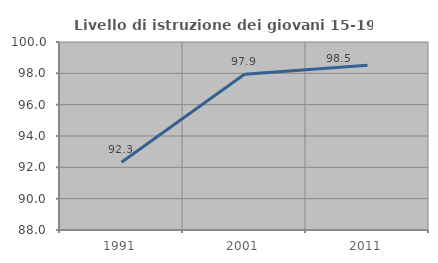
| Category | Livello di istruzione dei giovani 15-19 anni |
|---|---|
| 1991.0 | 92.325 |
| 2001.0 | 97.942 |
| 2011.0 | 98.515 |